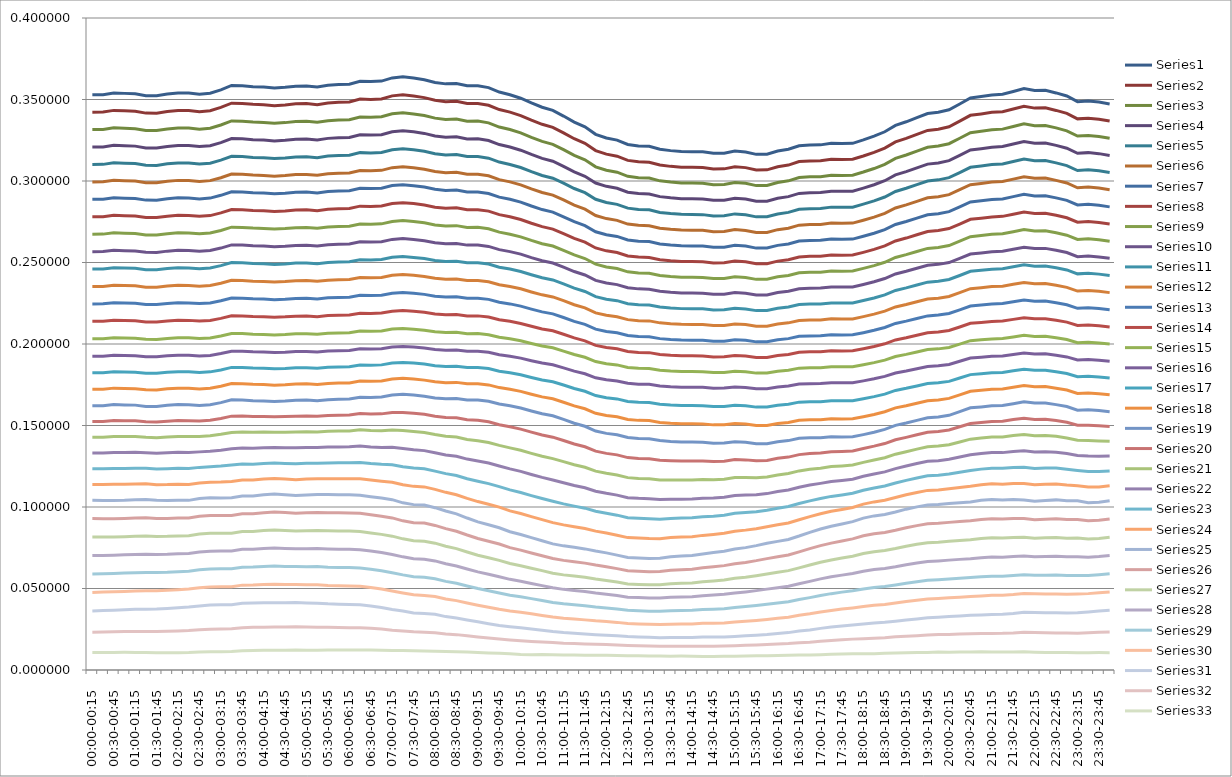
| Category | Series 0 | Series 1 | Series 2 | Series 3 | Series 4 | Series 5 | Series 6 | Series 7 | Series 8 | Series 9 | Series 10 | Series 11 | Series 12 | Series 13 | Series 14 | Series 15 | Series 16 | Series 17 | Series 18 | Series 19 | Series 20 | Series 21 | Series 22 | Series 23 | Series 24 | Series 25 | Series 26 | Series 27 | Series 28 | Series 29 | Series 30 | Series 31 | Series 32 |
|---|---|---|---|---|---|---|---|---|---|---|---|---|---|---|---|---|---|---|---|---|---|---|---|---|---|---|---|---|---|---|---|---|---|
| 00:00-00:15 | 0.353 | 0.342 | 0.332 | 0.321 | 0.31 | 0.299 | 0.289 | 0.278 | 0.267 | 0.257 | 0.246 | 0.235 | 0.225 | 0.214 | 0.203 | 0.193 | 0.182 | 0.172 | 0.162 | 0.152 | 0.143 | 0.133 | 0.124 | 0.114 | 0.104 | 0.093 | 0.082 | 0.07 | 0.059 | 0.048 | 0.036 | 0.023 | 0.011 |
| 00:15-00:30 | 0.353 | 0.342 | 0.332 | 0.321 | 0.31 | 0.3 | 0.289 | 0.278 | 0.267 | 0.257 | 0.246 | 0.235 | 0.225 | 0.214 | 0.203 | 0.193 | 0.182 | 0.172 | 0.162 | 0.152 | 0.143 | 0.133 | 0.123 | 0.114 | 0.104 | 0.093 | 0.082 | 0.07 | 0.059 | 0.048 | 0.036 | 0.023 | 0.011 |
| 00:30-00:45 | 0.354 | 0.343 | 0.333 | 0.322 | 0.311 | 0.3 | 0.29 | 0.279 | 0.268 | 0.257 | 0.247 | 0.236 | 0.225 | 0.215 | 0.204 | 0.193 | 0.183 | 0.173 | 0.163 | 0.153 | 0.143 | 0.133 | 0.124 | 0.114 | 0.104 | 0.093 | 0.082 | 0.07 | 0.059 | 0.048 | 0.037 | 0.023 | 0.011 |
| 00:45-01:00 | 0.354 | 0.343 | 0.332 | 0.322 | 0.311 | 0.3 | 0.289 | 0.279 | 0.268 | 0.257 | 0.247 | 0.236 | 0.225 | 0.214 | 0.204 | 0.193 | 0.183 | 0.173 | 0.163 | 0.153 | 0.143 | 0.133 | 0.124 | 0.114 | 0.104 | 0.093 | 0.082 | 0.071 | 0.059 | 0.048 | 0.037 | 0.024 | 0.011 |
| 01:00-01:15 | 0.354 | 0.343 | 0.332 | 0.321 | 0.311 | 0.3 | 0.289 | 0.279 | 0.268 | 0.257 | 0.246 | 0.236 | 0.225 | 0.214 | 0.204 | 0.193 | 0.183 | 0.173 | 0.163 | 0.153 | 0.143 | 0.134 | 0.124 | 0.114 | 0.104 | 0.093 | 0.082 | 0.071 | 0.06 | 0.048 | 0.037 | 0.024 | 0.011 |
| 01:15-01:30 | 0.352 | 0.342 | 0.331 | 0.32 | 0.31 | 0.299 | 0.288 | 0.278 | 0.267 | 0.256 | 0.246 | 0.235 | 0.224 | 0.214 | 0.203 | 0.192 | 0.182 | 0.172 | 0.162 | 0.152 | 0.143 | 0.133 | 0.124 | 0.114 | 0.105 | 0.093 | 0.082 | 0.071 | 0.06 | 0.049 | 0.037 | 0.024 | 0.011 |
| 01:30-01:45 | 0.352 | 0.342 | 0.331 | 0.32 | 0.31 | 0.299 | 0.288 | 0.278 | 0.267 | 0.256 | 0.246 | 0.235 | 0.224 | 0.213 | 0.203 | 0.192 | 0.182 | 0.172 | 0.162 | 0.152 | 0.143 | 0.133 | 0.123 | 0.114 | 0.104 | 0.093 | 0.082 | 0.071 | 0.06 | 0.049 | 0.037 | 0.024 | 0.011 |
| 01:45-02:00 | 0.353 | 0.343 | 0.332 | 0.321 | 0.311 | 0.3 | 0.289 | 0.278 | 0.268 | 0.257 | 0.246 | 0.236 | 0.225 | 0.214 | 0.203 | 0.193 | 0.183 | 0.172 | 0.162 | 0.153 | 0.143 | 0.133 | 0.123 | 0.114 | 0.104 | 0.093 | 0.082 | 0.071 | 0.06 | 0.049 | 0.038 | 0.024 | 0.011 |
| 02:00-02:15 | 0.354 | 0.343 | 0.333 | 0.322 | 0.311 | 0.3 | 0.29 | 0.279 | 0.268 | 0.257 | 0.247 | 0.236 | 0.225 | 0.215 | 0.204 | 0.193 | 0.183 | 0.173 | 0.163 | 0.153 | 0.143 | 0.134 | 0.124 | 0.114 | 0.104 | 0.093 | 0.082 | 0.071 | 0.06 | 0.049 | 0.038 | 0.024 | 0.011 |
| 02:15-02:30 | 0.354 | 0.343 | 0.332 | 0.322 | 0.311 | 0.3 | 0.29 | 0.279 | 0.268 | 0.257 | 0.247 | 0.236 | 0.225 | 0.214 | 0.204 | 0.193 | 0.183 | 0.173 | 0.163 | 0.153 | 0.143 | 0.133 | 0.124 | 0.114 | 0.104 | 0.093 | 0.082 | 0.071 | 0.061 | 0.05 | 0.039 | 0.024 | 0.011 |
| 02:30-02:45 | 0.353 | 0.343 | 0.332 | 0.321 | 0.31 | 0.3 | 0.289 | 0.278 | 0.268 | 0.257 | 0.246 | 0.235 | 0.225 | 0.214 | 0.203 | 0.193 | 0.183 | 0.172 | 0.162 | 0.153 | 0.143 | 0.134 | 0.124 | 0.115 | 0.105 | 0.094 | 0.083 | 0.072 | 0.061 | 0.05 | 0.039 | 0.025 | 0.011 |
| 02:45-03:00 | 0.354 | 0.343 | 0.332 | 0.322 | 0.311 | 0.3 | 0.29 | 0.279 | 0.268 | 0.257 | 0.247 | 0.236 | 0.225 | 0.214 | 0.204 | 0.193 | 0.183 | 0.173 | 0.163 | 0.153 | 0.144 | 0.134 | 0.125 | 0.115 | 0.106 | 0.095 | 0.084 | 0.073 | 0.062 | 0.051 | 0.04 | 0.025 | 0.011 |
| 03:00-03:15 | 0.356 | 0.345 | 0.334 | 0.324 | 0.313 | 0.302 | 0.291 | 0.28 | 0.27 | 0.259 | 0.248 | 0.237 | 0.226 | 0.216 | 0.205 | 0.194 | 0.184 | 0.174 | 0.164 | 0.154 | 0.145 | 0.135 | 0.125 | 0.115 | 0.106 | 0.095 | 0.084 | 0.073 | 0.062 | 0.051 | 0.04 | 0.025 | 0.011 |
| 03:15-03:30 | 0.359 | 0.348 | 0.337 | 0.326 | 0.315 | 0.304 | 0.293 | 0.283 | 0.272 | 0.261 | 0.25 | 0.239 | 0.228 | 0.217 | 0.206 | 0.196 | 0.186 | 0.176 | 0.166 | 0.156 | 0.146 | 0.136 | 0.126 | 0.116 | 0.106 | 0.095 | 0.084 | 0.073 | 0.062 | 0.051 | 0.04 | 0.025 | 0.011 |
| 03:30-03:45 | 0.358 | 0.348 | 0.337 | 0.326 | 0.315 | 0.304 | 0.293 | 0.282 | 0.272 | 0.261 | 0.25 | 0.239 | 0.228 | 0.217 | 0.206 | 0.196 | 0.186 | 0.176 | 0.166 | 0.156 | 0.146 | 0.136 | 0.126 | 0.117 | 0.107 | 0.096 | 0.085 | 0.074 | 0.063 | 0.052 | 0.041 | 0.026 | 0.012 |
| 03:45-04:00 | 0.358 | 0.347 | 0.336 | 0.325 | 0.314 | 0.304 | 0.293 | 0.282 | 0.271 | 0.26 | 0.249 | 0.239 | 0.228 | 0.217 | 0.206 | 0.195 | 0.185 | 0.175 | 0.165 | 0.156 | 0.146 | 0.136 | 0.126 | 0.117 | 0.107 | 0.096 | 0.085 | 0.074 | 0.063 | 0.052 | 0.041 | 0.026 | 0.012 |
| 04:00-04:15 | 0.358 | 0.347 | 0.336 | 0.325 | 0.314 | 0.303 | 0.293 | 0.282 | 0.271 | 0.26 | 0.249 | 0.238 | 0.228 | 0.217 | 0.206 | 0.195 | 0.185 | 0.175 | 0.165 | 0.156 | 0.146 | 0.136 | 0.127 | 0.117 | 0.108 | 0.097 | 0.086 | 0.075 | 0.064 | 0.052 | 0.041 | 0.026 | 0.012 |
| 04:15-04:30 | 0.357 | 0.346 | 0.335 | 0.325 | 0.314 | 0.303 | 0.292 | 0.281 | 0.27 | 0.26 | 0.249 | 0.238 | 0.227 | 0.216 | 0.206 | 0.195 | 0.185 | 0.175 | 0.165 | 0.155 | 0.146 | 0.136 | 0.127 | 0.118 | 0.108 | 0.097 | 0.086 | 0.075 | 0.064 | 0.053 | 0.041 | 0.026 | 0.012 |
| 04:30-04:45 | 0.357 | 0.347 | 0.336 | 0.325 | 0.314 | 0.303 | 0.292 | 0.282 | 0.271 | 0.26 | 0.249 | 0.238 | 0.227 | 0.217 | 0.206 | 0.195 | 0.185 | 0.175 | 0.165 | 0.155 | 0.146 | 0.136 | 0.127 | 0.117 | 0.108 | 0.097 | 0.086 | 0.075 | 0.064 | 0.052 | 0.041 | 0.026 | 0.012 |
| 04:45-05:00 | 0.358 | 0.347 | 0.336 | 0.326 | 0.315 | 0.304 | 0.293 | 0.282 | 0.271 | 0.261 | 0.25 | 0.239 | 0.228 | 0.217 | 0.206 | 0.195 | 0.185 | 0.175 | 0.165 | 0.156 | 0.146 | 0.136 | 0.127 | 0.117 | 0.107 | 0.096 | 0.085 | 0.074 | 0.063 | 0.052 | 0.041 | 0.026 | 0.012 |
| 05:00-05:15 | 0.358 | 0.347 | 0.337 | 0.326 | 0.315 | 0.304 | 0.293 | 0.282 | 0.271 | 0.261 | 0.25 | 0.239 | 0.228 | 0.217 | 0.206 | 0.195 | 0.185 | 0.176 | 0.166 | 0.156 | 0.146 | 0.137 | 0.127 | 0.117 | 0.107 | 0.096 | 0.085 | 0.074 | 0.063 | 0.052 | 0.041 | 0.026 | 0.012 |
| 05:15-05:30 | 0.358 | 0.347 | 0.336 | 0.325 | 0.314 | 0.303 | 0.293 | 0.282 | 0.271 | 0.26 | 0.249 | 0.238 | 0.228 | 0.217 | 0.206 | 0.195 | 0.185 | 0.175 | 0.165 | 0.156 | 0.146 | 0.136 | 0.127 | 0.117 | 0.108 | 0.097 | 0.086 | 0.075 | 0.063 | 0.052 | 0.041 | 0.026 | 0.012 |
| 05:30-05:45 | 0.359 | 0.348 | 0.337 | 0.326 | 0.315 | 0.304 | 0.294 | 0.283 | 0.272 | 0.261 | 0.25 | 0.239 | 0.228 | 0.217 | 0.207 | 0.196 | 0.186 | 0.176 | 0.166 | 0.156 | 0.146 | 0.137 | 0.127 | 0.117 | 0.108 | 0.097 | 0.085 | 0.074 | 0.063 | 0.052 | 0.041 | 0.026 | 0.012 |
| 05:45-06:00 | 0.359 | 0.348 | 0.337 | 0.326 | 0.316 | 0.305 | 0.294 | 0.283 | 0.272 | 0.261 | 0.25 | 0.239 | 0.229 | 0.218 | 0.207 | 0.196 | 0.186 | 0.176 | 0.166 | 0.156 | 0.147 | 0.137 | 0.127 | 0.117 | 0.108 | 0.096 | 0.085 | 0.074 | 0.063 | 0.052 | 0.04 | 0.026 | 0.012 |
| 06:00-06:15 | 0.359 | 0.348 | 0.338 | 0.327 | 0.316 | 0.305 | 0.294 | 0.283 | 0.272 | 0.261 | 0.25 | 0.24 | 0.229 | 0.218 | 0.207 | 0.196 | 0.186 | 0.176 | 0.166 | 0.156 | 0.147 | 0.137 | 0.127 | 0.117 | 0.108 | 0.096 | 0.085 | 0.074 | 0.063 | 0.052 | 0.04 | 0.026 | 0.012 |
| 06:15-06:30 | 0.361 | 0.35 | 0.339 | 0.328 | 0.317 | 0.306 | 0.296 | 0.285 | 0.274 | 0.263 | 0.252 | 0.241 | 0.23 | 0.219 | 0.208 | 0.197 | 0.187 | 0.177 | 0.167 | 0.157 | 0.147 | 0.137 | 0.127 | 0.117 | 0.107 | 0.096 | 0.085 | 0.074 | 0.063 | 0.051 | 0.04 | 0.026 | 0.012 |
| 06:30-06:45 | 0.361 | 0.35 | 0.339 | 0.328 | 0.317 | 0.306 | 0.295 | 0.284 | 0.273 | 0.263 | 0.252 | 0.241 | 0.23 | 0.219 | 0.208 | 0.197 | 0.187 | 0.177 | 0.167 | 0.157 | 0.147 | 0.137 | 0.127 | 0.117 | 0.106 | 0.095 | 0.084 | 0.073 | 0.062 | 0.051 | 0.039 | 0.026 | 0.012 |
| 06:45-07:00 | 0.361 | 0.35 | 0.339 | 0.328 | 0.317 | 0.307 | 0.296 | 0.285 | 0.274 | 0.263 | 0.252 | 0.241 | 0.23 | 0.219 | 0.208 | 0.197 | 0.187 | 0.177 | 0.167 | 0.157 | 0.147 | 0.136 | 0.126 | 0.116 | 0.105 | 0.094 | 0.083 | 0.072 | 0.061 | 0.05 | 0.038 | 0.025 | 0.012 |
| 07:00-07:15 | 0.363 | 0.352 | 0.341 | 0.33 | 0.319 | 0.308 | 0.297 | 0.286 | 0.275 | 0.264 | 0.253 | 0.242 | 0.231 | 0.22 | 0.209 | 0.198 | 0.188 | 0.179 | 0.169 | 0.158 | 0.147 | 0.137 | 0.126 | 0.115 | 0.105 | 0.093 | 0.082 | 0.071 | 0.06 | 0.048 | 0.037 | 0.024 | 0.012 |
| 07:15-07:30 | 0.364 | 0.353 | 0.342 | 0.331 | 0.32 | 0.309 | 0.298 | 0.287 | 0.276 | 0.265 | 0.254 | 0.243 | 0.232 | 0.221 | 0.21 | 0.198 | 0.189 | 0.179 | 0.169 | 0.158 | 0.147 | 0.136 | 0.125 | 0.114 | 0.103 | 0.092 | 0.08 | 0.069 | 0.058 | 0.047 | 0.036 | 0.024 | 0.012 |
| 07:30-07:45 | 0.363 | 0.352 | 0.341 | 0.33 | 0.319 | 0.308 | 0.297 | 0.286 | 0.275 | 0.264 | 0.253 | 0.242 | 0.231 | 0.22 | 0.209 | 0.198 | 0.188 | 0.178 | 0.169 | 0.157 | 0.146 | 0.135 | 0.124 | 0.113 | 0.101 | 0.09 | 0.079 | 0.068 | 0.057 | 0.046 | 0.035 | 0.023 | 0.012 |
| 07:45-08:00 | 0.362 | 0.351 | 0.34 | 0.329 | 0.318 | 0.307 | 0.296 | 0.285 | 0.274 | 0.263 | 0.252 | 0.241 | 0.23 | 0.219 | 0.208 | 0.198 | 0.188 | 0.178 | 0.168 | 0.157 | 0.146 | 0.135 | 0.123 | 0.112 | 0.101 | 0.09 | 0.079 | 0.068 | 0.057 | 0.046 | 0.035 | 0.023 | 0.012 |
| 08:00-08:15 | 0.36 | 0.349 | 0.339 | 0.328 | 0.317 | 0.306 | 0.295 | 0.284 | 0.273 | 0.262 | 0.251 | 0.24 | 0.229 | 0.218 | 0.208 | 0.197 | 0.187 | 0.177 | 0.167 | 0.156 | 0.144 | 0.133 | 0.122 | 0.111 | 0.1 | 0.089 | 0.078 | 0.067 | 0.056 | 0.045 | 0.034 | 0.023 | 0.012 |
| 08:15-08:30 | 0.36 | 0.349 | 0.338 | 0.327 | 0.316 | 0.305 | 0.294 | 0.283 | 0.272 | 0.262 | 0.251 | 0.24 | 0.229 | 0.218 | 0.207 | 0.196 | 0.186 | 0.176 | 0.166 | 0.155 | 0.143 | 0.132 | 0.12 | 0.109 | 0.098 | 0.087 | 0.076 | 0.065 | 0.054 | 0.044 | 0.033 | 0.022 | 0.011 |
| 08:30-08:45 | 0.36 | 0.349 | 0.338 | 0.327 | 0.316 | 0.305 | 0.294 | 0.284 | 0.273 | 0.262 | 0.251 | 0.24 | 0.229 | 0.218 | 0.207 | 0.196 | 0.186 | 0.176 | 0.167 | 0.155 | 0.143 | 0.131 | 0.119 | 0.108 | 0.096 | 0.085 | 0.074 | 0.064 | 0.053 | 0.043 | 0.032 | 0.022 | 0.011 |
| 08:45-09:00 | 0.358 | 0.348 | 0.337 | 0.326 | 0.315 | 0.304 | 0.293 | 0.282 | 0.272 | 0.261 | 0.25 | 0.239 | 0.228 | 0.217 | 0.206 | 0.196 | 0.186 | 0.176 | 0.166 | 0.154 | 0.141 | 0.129 | 0.117 | 0.105 | 0.093 | 0.083 | 0.072 | 0.062 | 0.052 | 0.041 | 0.031 | 0.021 | 0.011 |
| 09:00-09:15 | 0.358 | 0.348 | 0.337 | 0.326 | 0.315 | 0.304 | 0.293 | 0.282 | 0.272 | 0.261 | 0.25 | 0.239 | 0.228 | 0.217 | 0.206 | 0.196 | 0.186 | 0.176 | 0.166 | 0.153 | 0.141 | 0.128 | 0.116 | 0.103 | 0.091 | 0.081 | 0.07 | 0.06 | 0.05 | 0.04 | 0.03 | 0.02 | 0.011 |
| 09:15-09:30 | 0.357 | 0.346 | 0.336 | 0.325 | 0.314 | 0.303 | 0.292 | 0.282 | 0.271 | 0.26 | 0.249 | 0.238 | 0.227 | 0.217 | 0.206 | 0.195 | 0.185 | 0.175 | 0.165 | 0.152 | 0.14 | 0.127 | 0.114 | 0.102 | 0.089 | 0.079 | 0.069 | 0.059 | 0.049 | 0.039 | 0.028 | 0.02 | 0.01 |
| 09:30-09:45 | 0.355 | 0.344 | 0.333 | 0.322 | 0.312 | 0.301 | 0.29 | 0.279 | 0.269 | 0.258 | 0.247 | 0.236 | 0.226 | 0.215 | 0.204 | 0.193 | 0.183 | 0.173 | 0.163 | 0.15 | 0.138 | 0.125 | 0.113 | 0.1 | 0.087 | 0.077 | 0.067 | 0.057 | 0.047 | 0.037 | 0.027 | 0.019 | 0.01 |
| 09:45-10:00 | 0.353 | 0.342 | 0.332 | 0.321 | 0.31 | 0.299 | 0.289 | 0.278 | 0.267 | 0.257 | 0.246 | 0.235 | 0.225 | 0.214 | 0.203 | 0.193 | 0.182 | 0.172 | 0.162 | 0.149 | 0.136 | 0.123 | 0.111 | 0.098 | 0.085 | 0.075 | 0.065 | 0.056 | 0.046 | 0.036 | 0.027 | 0.018 | 0.01 |
| 10:00-10:15 | 0.351 | 0.34 | 0.33 | 0.319 | 0.308 | 0.298 | 0.287 | 0.276 | 0.266 | 0.255 | 0.244 | 0.234 | 0.223 | 0.213 | 0.202 | 0.191 | 0.181 | 0.171 | 0.161 | 0.148 | 0.135 | 0.122 | 0.109 | 0.096 | 0.083 | 0.074 | 0.064 | 0.054 | 0.045 | 0.035 | 0.026 | 0.018 | 0.01 |
| 10:15-10:30 | 0.348 | 0.337 | 0.327 | 0.316 | 0.306 | 0.295 | 0.285 | 0.274 | 0.264 | 0.253 | 0.242 | 0.232 | 0.221 | 0.211 | 0.2 | 0.19 | 0.179 | 0.169 | 0.159 | 0.146 | 0.133 | 0.12 | 0.107 | 0.094 | 0.081 | 0.072 | 0.062 | 0.053 | 0.044 | 0.034 | 0.025 | 0.018 | 0.009 |
| 10:30-10:45 | 0.345 | 0.335 | 0.324 | 0.314 | 0.303 | 0.293 | 0.282 | 0.272 | 0.262 | 0.251 | 0.241 | 0.23 | 0.22 | 0.209 | 0.199 | 0.188 | 0.178 | 0.168 | 0.157 | 0.144 | 0.131 | 0.118 | 0.105 | 0.092 | 0.079 | 0.07 | 0.061 | 0.052 | 0.043 | 0.033 | 0.024 | 0.017 | 0.009 |
| 10:45-11:00 | 0.343 | 0.333 | 0.323 | 0.312 | 0.302 | 0.291 | 0.281 | 0.271 | 0.26 | 0.25 | 0.239 | 0.229 | 0.218 | 0.208 | 0.198 | 0.187 | 0.177 | 0.166 | 0.156 | 0.143 | 0.13 | 0.117 | 0.103 | 0.09 | 0.077 | 0.068 | 0.059 | 0.05 | 0.041 | 0.032 | 0.024 | 0.017 | 0.009 |
| 11:00-11:15 | 0.34 | 0.33 | 0.319 | 0.309 | 0.299 | 0.288 | 0.278 | 0.268 | 0.257 | 0.247 | 0.237 | 0.227 | 0.216 | 0.206 | 0.196 | 0.185 | 0.175 | 0.164 | 0.154 | 0.141 | 0.128 | 0.115 | 0.102 | 0.089 | 0.076 | 0.067 | 0.058 | 0.049 | 0.041 | 0.032 | 0.023 | 0.016 | 0.009 |
| 11:15-11:30 | 0.336 | 0.326 | 0.316 | 0.306 | 0.295 | 0.285 | 0.275 | 0.265 | 0.255 | 0.244 | 0.234 | 0.224 | 0.214 | 0.204 | 0.194 | 0.183 | 0.173 | 0.162 | 0.151 | 0.139 | 0.126 | 0.113 | 0.101 | 0.088 | 0.075 | 0.066 | 0.058 | 0.049 | 0.04 | 0.031 | 0.023 | 0.016 | 0.009 |
| 11:30-11:45 | 0.333 | 0.323 | 0.313 | 0.303 | 0.293 | 0.283 | 0.273 | 0.263 | 0.252 | 0.242 | 0.232 | 0.222 | 0.212 | 0.202 | 0.192 | 0.182 | 0.171 | 0.16 | 0.15 | 0.137 | 0.124 | 0.112 | 0.099 | 0.087 | 0.074 | 0.066 | 0.057 | 0.048 | 0.039 | 0.031 | 0.022 | 0.016 | 0.009 |
| 11:45-12:00 | 0.329 | 0.319 | 0.309 | 0.299 | 0.289 | 0.279 | 0.269 | 0.259 | 0.249 | 0.239 | 0.229 | 0.219 | 0.209 | 0.199 | 0.189 | 0.179 | 0.168 | 0.157 | 0.147 | 0.134 | 0.122 | 0.11 | 0.097 | 0.085 | 0.073 | 0.064 | 0.056 | 0.047 | 0.039 | 0.03 | 0.022 | 0.016 | 0.009 |
| 12:00-12:15 | 0.326 | 0.316 | 0.307 | 0.297 | 0.287 | 0.277 | 0.267 | 0.257 | 0.247 | 0.237 | 0.227 | 0.218 | 0.208 | 0.198 | 0.188 | 0.178 | 0.167 | 0.156 | 0.145 | 0.133 | 0.121 | 0.108 | 0.096 | 0.084 | 0.072 | 0.063 | 0.055 | 0.047 | 0.038 | 0.03 | 0.021 | 0.016 | 0.009 |
| 12:15-12:30 | 0.325 | 0.315 | 0.305 | 0.296 | 0.286 | 0.276 | 0.266 | 0.256 | 0.246 | 0.236 | 0.227 | 0.217 | 0.207 | 0.197 | 0.187 | 0.177 | 0.166 | 0.155 | 0.144 | 0.132 | 0.12 | 0.107 | 0.095 | 0.083 | 0.07 | 0.062 | 0.054 | 0.046 | 0.037 | 0.029 | 0.021 | 0.015 | 0.009 |
| 12:30-12:45 | 0.322 | 0.313 | 0.303 | 0.293 | 0.283 | 0.274 | 0.264 | 0.254 | 0.244 | 0.234 | 0.225 | 0.215 | 0.205 | 0.195 | 0.186 | 0.176 | 0.165 | 0.154 | 0.143 | 0.13 | 0.118 | 0.106 | 0.093 | 0.081 | 0.069 | 0.061 | 0.053 | 0.045 | 0.037 | 0.029 | 0.021 | 0.015 | 0.009 |
| 12:45-13:00 | 0.322 | 0.312 | 0.302 | 0.292 | 0.283 | 0.273 | 0.263 | 0.253 | 0.244 | 0.234 | 0.224 | 0.214 | 0.205 | 0.195 | 0.185 | 0.175 | 0.164 | 0.153 | 0.142 | 0.13 | 0.118 | 0.105 | 0.093 | 0.081 | 0.069 | 0.061 | 0.053 | 0.044 | 0.036 | 0.028 | 0.02 | 0.015 | 0.009 |
| 13:00-13:15 | 0.321 | 0.312 | 0.302 | 0.292 | 0.282 | 0.273 | 0.263 | 0.253 | 0.243 | 0.234 | 0.224 | 0.214 | 0.204 | 0.195 | 0.185 | 0.175 | 0.164 | 0.153 | 0.142 | 0.13 | 0.117 | 0.105 | 0.093 | 0.081 | 0.068 | 0.06 | 0.052 | 0.044 | 0.036 | 0.028 | 0.02 | 0.015 | 0.009 |
| 13:15-13:30 | 0.319 | 0.31 | 0.3 | 0.29 | 0.281 | 0.271 | 0.261 | 0.252 | 0.242 | 0.232 | 0.223 | 0.213 | 0.203 | 0.194 | 0.184 | 0.174 | 0.163 | 0.152 | 0.141 | 0.129 | 0.117 | 0.105 | 0.093 | 0.081 | 0.069 | 0.06 | 0.052 | 0.044 | 0.036 | 0.028 | 0.02 | 0.015 | 0.009 |
| 13:30-13:45 | 0.319 | 0.309 | 0.299 | 0.29 | 0.28 | 0.27 | 0.261 | 0.251 | 0.241 | 0.232 | 0.222 | 0.212 | 0.203 | 0.193 | 0.183 | 0.174 | 0.163 | 0.151 | 0.14 | 0.128 | 0.117 | 0.105 | 0.093 | 0.081 | 0.07 | 0.061 | 0.053 | 0.045 | 0.036 | 0.028 | 0.02 | 0.015 | 0.008 |
| 13:45-14:00 | 0.318 | 0.308 | 0.299 | 0.289 | 0.28 | 0.27 | 0.26 | 0.251 | 0.241 | 0.231 | 0.222 | 0.212 | 0.202 | 0.193 | 0.183 | 0.174 | 0.162 | 0.151 | 0.14 | 0.128 | 0.116 | 0.105 | 0.093 | 0.082 | 0.07 | 0.062 | 0.053 | 0.045 | 0.036 | 0.028 | 0.02 | 0.015 | 0.009 |
| 14:00-14:15 | 0.318 | 0.308 | 0.299 | 0.289 | 0.279 | 0.27 | 0.26 | 0.251 | 0.241 | 0.231 | 0.222 | 0.212 | 0.202 | 0.193 | 0.183 | 0.173 | 0.162 | 0.151 | 0.14 | 0.128 | 0.117 | 0.105 | 0.093 | 0.082 | 0.07 | 0.062 | 0.053 | 0.045 | 0.037 | 0.028 | 0.02 | 0.015 | 0.008 |
| 14:15-14:30 | 0.318 | 0.308 | 0.299 | 0.289 | 0.279 | 0.27 | 0.26 | 0.25 | 0.241 | 0.231 | 0.222 | 0.212 | 0.202 | 0.193 | 0.183 | 0.173 | 0.162 | 0.151 | 0.14 | 0.128 | 0.117 | 0.105 | 0.094 | 0.083 | 0.071 | 0.063 | 0.054 | 0.046 | 0.037 | 0.029 | 0.02 | 0.015 | 0.008 |
| 14:30-14:45 | 0.317 | 0.307 | 0.298 | 0.288 | 0.279 | 0.269 | 0.259 | 0.25 | 0.24 | 0.231 | 0.221 | 0.211 | 0.202 | 0.192 | 0.182 | 0.173 | 0.162 | 0.15 | 0.139 | 0.128 | 0.117 | 0.106 | 0.094 | 0.083 | 0.072 | 0.063 | 0.055 | 0.046 | 0.037 | 0.029 | 0.02 | 0.015 | 0.008 |
| 14:45-15:00 | 0.317 | 0.307 | 0.298 | 0.288 | 0.279 | 0.269 | 0.259 | 0.25 | 0.24 | 0.231 | 0.221 | 0.211 | 0.202 | 0.192 | 0.183 | 0.173 | 0.162 | 0.15 | 0.139 | 0.128 | 0.117 | 0.106 | 0.095 | 0.084 | 0.073 | 0.064 | 0.055 | 0.046 | 0.038 | 0.029 | 0.02 | 0.015 | 0.008 |
| 15:00-15:15 | 0.318 | 0.309 | 0.299 | 0.289 | 0.28 | 0.27 | 0.261 | 0.251 | 0.241 | 0.232 | 0.222 | 0.212 | 0.203 | 0.193 | 0.183 | 0.174 | 0.162 | 0.151 | 0.14 | 0.129 | 0.118 | 0.107 | 0.096 | 0.085 | 0.074 | 0.065 | 0.056 | 0.047 | 0.038 | 0.029 | 0.021 | 0.015 | 0.008 |
| 15:15-15:30 | 0.318 | 0.308 | 0.299 | 0.289 | 0.279 | 0.27 | 0.26 | 0.25 | 0.241 | 0.231 | 0.222 | 0.212 | 0.202 | 0.193 | 0.183 | 0.173 | 0.162 | 0.151 | 0.14 | 0.129 | 0.118 | 0.107 | 0.097 | 0.086 | 0.075 | 0.066 | 0.057 | 0.048 | 0.039 | 0.03 | 0.021 | 0.015 | 0.009 |
| 15:30-15:45 | 0.316 | 0.307 | 0.297 | 0.288 | 0.278 | 0.268 | 0.259 | 0.249 | 0.24 | 0.23 | 0.22 | 0.211 | 0.201 | 0.192 | 0.182 | 0.173 | 0.161 | 0.15 | 0.139 | 0.128 | 0.118 | 0.107 | 0.097 | 0.087 | 0.076 | 0.067 | 0.058 | 0.049 | 0.04 | 0.03 | 0.021 | 0.015 | 0.009 |
| 15:45-16:00 | 0.316 | 0.307 | 0.297 | 0.288 | 0.278 | 0.268 | 0.259 | 0.249 | 0.24 | 0.23 | 0.221 | 0.211 | 0.201 | 0.192 | 0.182 | 0.173 | 0.161 | 0.15 | 0.139 | 0.129 | 0.118 | 0.108 | 0.098 | 0.088 | 0.078 | 0.068 | 0.059 | 0.05 | 0.04 | 0.031 | 0.022 | 0.016 | 0.009 |
| 16:00-16:15 | 0.318 | 0.309 | 0.299 | 0.289 | 0.28 | 0.27 | 0.261 | 0.251 | 0.241 | 0.232 | 0.222 | 0.212 | 0.203 | 0.193 | 0.183 | 0.174 | 0.162 | 0.151 | 0.14 | 0.13 | 0.12 | 0.109 | 0.099 | 0.089 | 0.079 | 0.069 | 0.06 | 0.051 | 0.041 | 0.032 | 0.022 | 0.016 | 0.009 |
| 16:15-16:30 | 0.319 | 0.31 | 0.3 | 0.29 | 0.281 | 0.271 | 0.261 | 0.252 | 0.242 | 0.232 | 0.223 | 0.213 | 0.203 | 0.194 | 0.184 | 0.174 | 0.163 | 0.152 | 0.141 | 0.131 | 0.121 | 0.11 | 0.1 | 0.09 | 0.08 | 0.071 | 0.061 | 0.051 | 0.042 | 0.032 | 0.023 | 0.016 | 0.009 |
| 16:30-16:45 | 0.322 | 0.312 | 0.302 | 0.292 | 0.283 | 0.273 | 0.263 | 0.253 | 0.244 | 0.234 | 0.224 | 0.214 | 0.205 | 0.195 | 0.185 | 0.175 | 0.164 | 0.153 | 0.142 | 0.132 | 0.122 | 0.112 | 0.102 | 0.092 | 0.082 | 0.072 | 0.063 | 0.053 | 0.043 | 0.034 | 0.024 | 0.017 | 0.009 |
| 16:45-17:00 | 0.322 | 0.312 | 0.303 | 0.293 | 0.283 | 0.273 | 0.264 | 0.254 | 0.244 | 0.234 | 0.224 | 0.215 | 0.205 | 0.195 | 0.185 | 0.176 | 0.165 | 0.153 | 0.142 | 0.133 | 0.123 | 0.113 | 0.104 | 0.094 | 0.084 | 0.074 | 0.064 | 0.054 | 0.044 | 0.034 | 0.025 | 0.017 | 0.009 |
| 17:00-17:15 | 0.322 | 0.312 | 0.303 | 0.293 | 0.283 | 0.273 | 0.264 | 0.254 | 0.244 | 0.234 | 0.225 | 0.215 | 0.205 | 0.195 | 0.185 | 0.176 | 0.165 | 0.154 | 0.142 | 0.133 | 0.124 | 0.114 | 0.105 | 0.096 | 0.087 | 0.076 | 0.066 | 0.056 | 0.046 | 0.036 | 0.026 | 0.018 | 0.009 |
| 17:15-17:30 | 0.323 | 0.313 | 0.304 | 0.294 | 0.284 | 0.274 | 0.264 | 0.255 | 0.245 | 0.235 | 0.225 | 0.215 | 0.206 | 0.196 | 0.186 | 0.176 | 0.165 | 0.154 | 0.143 | 0.134 | 0.125 | 0.116 | 0.107 | 0.097 | 0.088 | 0.078 | 0.067 | 0.057 | 0.047 | 0.037 | 0.026 | 0.018 | 0.01 |
| 17:30-17:45 | 0.323 | 0.313 | 0.303 | 0.294 | 0.284 | 0.274 | 0.264 | 0.254 | 0.245 | 0.235 | 0.225 | 0.215 | 0.206 | 0.196 | 0.186 | 0.176 | 0.165 | 0.154 | 0.143 | 0.134 | 0.125 | 0.116 | 0.107 | 0.099 | 0.09 | 0.079 | 0.069 | 0.058 | 0.048 | 0.037 | 0.027 | 0.019 | 0.01 |
| 17:45-18:00 | 0.323 | 0.313 | 0.304 | 0.294 | 0.284 | 0.274 | 0.264 | 0.255 | 0.245 | 0.235 | 0.225 | 0.215 | 0.206 | 0.196 | 0.186 | 0.176 | 0.165 | 0.154 | 0.143 | 0.134 | 0.126 | 0.117 | 0.108 | 0.1 | 0.091 | 0.08 | 0.07 | 0.059 | 0.049 | 0.038 | 0.028 | 0.019 | 0.01 |
| 18:00-18:15 | 0.325 | 0.315 | 0.306 | 0.296 | 0.286 | 0.276 | 0.266 | 0.256 | 0.246 | 0.237 | 0.227 | 0.217 | 0.207 | 0.197 | 0.187 | 0.177 | 0.166 | 0.155 | 0.144 | 0.136 | 0.127 | 0.119 | 0.11 | 0.102 | 0.093 | 0.082 | 0.071 | 0.061 | 0.05 | 0.039 | 0.028 | 0.019 | 0.01 |
| 18:15-18:30 | 0.327 | 0.318 | 0.308 | 0.298 | 0.288 | 0.278 | 0.268 | 0.258 | 0.248 | 0.238 | 0.228 | 0.218 | 0.208 | 0.198 | 0.189 | 0.179 | 0.168 | 0.157 | 0.146 | 0.137 | 0.129 | 0.12 | 0.112 | 0.103 | 0.095 | 0.084 | 0.073 | 0.062 | 0.051 | 0.04 | 0.029 | 0.02 | 0.01 |
| 18:30-18:45 | 0.33 | 0.32 | 0.31 | 0.3 | 0.29 | 0.28 | 0.27 | 0.26 | 0.25 | 0.24 | 0.23 | 0.22 | 0.21 | 0.2 | 0.19 | 0.18 | 0.169 | 0.158 | 0.148 | 0.139 | 0.13 | 0.122 | 0.113 | 0.104 | 0.095 | 0.084 | 0.073 | 0.062 | 0.051 | 0.04 | 0.029 | 0.02 | 0.01 |
| 18:45-19:00 | 0.334 | 0.324 | 0.314 | 0.304 | 0.294 | 0.283 | 0.273 | 0.263 | 0.253 | 0.243 | 0.233 | 0.223 | 0.213 | 0.202 | 0.192 | 0.182 | 0.172 | 0.161 | 0.15 | 0.141 | 0.132 | 0.124 | 0.115 | 0.106 | 0.097 | 0.086 | 0.075 | 0.063 | 0.052 | 0.041 | 0.03 | 0.02 | 0.01 |
| 19:00-19:15 | 0.336 | 0.326 | 0.316 | 0.306 | 0.296 | 0.285 | 0.275 | 0.265 | 0.255 | 0.245 | 0.234 | 0.224 | 0.214 | 0.204 | 0.194 | 0.183 | 0.173 | 0.162 | 0.152 | 0.143 | 0.134 | 0.125 | 0.116 | 0.108 | 0.099 | 0.087 | 0.076 | 0.065 | 0.053 | 0.042 | 0.031 | 0.021 | 0.011 |
| 19:15-19:30 | 0.339 | 0.329 | 0.318 | 0.308 | 0.298 | 0.288 | 0.277 | 0.267 | 0.257 | 0.246 | 0.236 | 0.226 | 0.216 | 0.205 | 0.195 | 0.185 | 0.174 | 0.164 | 0.153 | 0.144 | 0.135 | 0.127 | 0.118 | 0.109 | 0.1 | 0.089 | 0.077 | 0.066 | 0.054 | 0.043 | 0.031 | 0.021 | 0.011 |
| 19:30-19:45 | 0.341 | 0.331 | 0.321 | 0.31 | 0.3 | 0.29 | 0.279 | 0.269 | 0.259 | 0.248 | 0.238 | 0.228 | 0.217 | 0.207 | 0.197 | 0.186 | 0.176 | 0.165 | 0.155 | 0.146 | 0.137 | 0.128 | 0.119 | 0.11 | 0.101 | 0.09 | 0.078 | 0.067 | 0.055 | 0.044 | 0.032 | 0.021 | 0.011 |
| 19:45-20:00 | 0.342 | 0.332 | 0.321 | 0.311 | 0.301 | 0.29 | 0.28 | 0.27 | 0.259 | 0.249 | 0.238 | 0.228 | 0.218 | 0.207 | 0.197 | 0.187 | 0.176 | 0.166 | 0.155 | 0.146 | 0.137 | 0.128 | 0.119 | 0.11 | 0.102 | 0.09 | 0.078 | 0.067 | 0.055 | 0.044 | 0.032 | 0.022 | 0.011 |
| 20:00-20:15 | 0.344 | 0.333 | 0.323 | 0.312 | 0.302 | 0.292 | 0.281 | 0.271 | 0.26 | 0.25 | 0.24 | 0.229 | 0.219 | 0.208 | 0.198 | 0.187 | 0.177 | 0.167 | 0.156 | 0.147 | 0.138 | 0.129 | 0.12 | 0.111 | 0.102 | 0.091 | 0.079 | 0.067 | 0.056 | 0.044 | 0.033 | 0.022 | 0.011 |
| 20:15-20:30 | 0.347 | 0.337 | 0.326 | 0.316 | 0.305 | 0.295 | 0.284 | 0.274 | 0.263 | 0.253 | 0.242 | 0.232 | 0.221 | 0.21 | 0.2 | 0.189 | 0.179 | 0.169 | 0.158 | 0.149 | 0.14 | 0.131 | 0.121 | 0.112 | 0.103 | 0.091 | 0.079 | 0.068 | 0.056 | 0.045 | 0.033 | 0.022 | 0.011 |
| 20:30-20:45 | 0.351 | 0.34 | 0.33 | 0.319 | 0.308 | 0.298 | 0.287 | 0.276 | 0.266 | 0.255 | 0.245 | 0.234 | 0.223 | 0.213 | 0.202 | 0.191 | 0.181 | 0.171 | 0.161 | 0.151 | 0.142 | 0.132 | 0.122 | 0.113 | 0.103 | 0.091 | 0.08 | 0.068 | 0.057 | 0.045 | 0.034 | 0.022 | 0.011 |
| 20:45-21:00 | 0.352 | 0.341 | 0.331 | 0.32 | 0.309 | 0.299 | 0.288 | 0.277 | 0.267 | 0.256 | 0.245 | 0.235 | 0.224 | 0.213 | 0.203 | 0.192 | 0.182 | 0.172 | 0.161 | 0.152 | 0.142 | 0.133 | 0.123 | 0.114 | 0.104 | 0.092 | 0.081 | 0.069 | 0.057 | 0.045 | 0.034 | 0.022 | 0.011 |
| 21:00-21:15 | 0.353 | 0.342 | 0.331 | 0.321 | 0.31 | 0.299 | 0.289 | 0.278 | 0.267 | 0.257 | 0.246 | 0.235 | 0.225 | 0.214 | 0.203 | 0.192 | 0.182 | 0.172 | 0.162 | 0.152 | 0.143 | 0.133 | 0.124 | 0.114 | 0.105 | 0.093 | 0.081 | 0.069 | 0.058 | 0.046 | 0.034 | 0.022 | 0.011 |
| 21:15-21:30 | 0.353 | 0.343 | 0.332 | 0.321 | 0.31 | 0.3 | 0.289 | 0.278 | 0.268 | 0.257 | 0.246 | 0.235 | 0.225 | 0.214 | 0.203 | 0.193 | 0.183 | 0.172 | 0.162 | 0.153 | 0.143 | 0.133 | 0.124 | 0.114 | 0.104 | 0.093 | 0.081 | 0.069 | 0.058 | 0.046 | 0.034 | 0.022 | 0.011 |
| 21:30-21:45 | 0.355 | 0.344 | 0.333 | 0.323 | 0.312 | 0.301 | 0.29 | 0.28 | 0.269 | 0.258 | 0.247 | 0.237 | 0.226 | 0.215 | 0.204 | 0.194 | 0.184 | 0.173 | 0.163 | 0.154 | 0.144 | 0.134 | 0.124 | 0.114 | 0.105 | 0.093 | 0.081 | 0.07 | 0.058 | 0.046 | 0.035 | 0.023 | 0.011 |
| 21:45-22:00 | 0.357 | 0.346 | 0.335 | 0.324 | 0.313 | 0.303 | 0.292 | 0.281 | 0.27 | 0.259 | 0.249 | 0.238 | 0.227 | 0.216 | 0.205 | 0.195 | 0.185 | 0.175 | 0.164 | 0.154 | 0.144 | 0.134 | 0.124 | 0.114 | 0.104 | 0.093 | 0.081 | 0.07 | 0.058 | 0.047 | 0.035 | 0.023 | 0.011 |
| 22:00-22:15 | 0.355 | 0.345 | 0.334 | 0.323 | 0.312 | 0.302 | 0.291 | 0.28 | 0.269 | 0.259 | 0.248 | 0.237 | 0.226 | 0.215 | 0.205 | 0.194 | 0.184 | 0.174 | 0.164 | 0.154 | 0.144 | 0.134 | 0.124 | 0.114 | 0.104 | 0.092 | 0.081 | 0.069 | 0.058 | 0.047 | 0.035 | 0.023 | 0.011 |
| 22:15-22:30 | 0.356 | 0.345 | 0.334 | 0.323 | 0.313 | 0.302 | 0.291 | 0.28 | 0.269 | 0.259 | 0.248 | 0.237 | 0.226 | 0.216 | 0.205 | 0.194 | 0.184 | 0.174 | 0.164 | 0.154 | 0.144 | 0.134 | 0.124 | 0.114 | 0.104 | 0.093 | 0.081 | 0.07 | 0.058 | 0.047 | 0.035 | 0.023 | 0.011 |
| 22:30-22:45 | 0.354 | 0.343 | 0.333 | 0.322 | 0.311 | 0.3 | 0.29 | 0.279 | 0.268 | 0.257 | 0.247 | 0.236 | 0.225 | 0.215 | 0.204 | 0.193 | 0.183 | 0.173 | 0.163 | 0.153 | 0.143 | 0.134 | 0.124 | 0.114 | 0.104 | 0.093 | 0.081 | 0.07 | 0.058 | 0.047 | 0.035 | 0.023 | 0.011 |
| 22:45-23:00 | 0.352 | 0.341 | 0.331 | 0.32 | 0.309 | 0.299 | 0.288 | 0.277 | 0.267 | 0.256 | 0.245 | 0.235 | 0.224 | 0.213 | 0.203 | 0.192 | 0.182 | 0.172 | 0.162 | 0.152 | 0.142 | 0.133 | 0.123 | 0.113 | 0.104 | 0.092 | 0.081 | 0.069 | 0.058 | 0.046 | 0.035 | 0.023 | 0.011 |
| 23:00-23:15 | 0.349 | 0.338 | 0.328 | 0.317 | 0.306 | 0.296 | 0.285 | 0.275 | 0.264 | 0.254 | 0.243 | 0.232 | 0.222 | 0.211 | 0.201 | 0.19 | 0.18 | 0.17 | 0.159 | 0.15 | 0.141 | 0.132 | 0.122 | 0.113 | 0.104 | 0.092 | 0.081 | 0.069 | 0.058 | 0.047 | 0.035 | 0.023 | 0.011 |
| 23:15-23:30 | 0.349 | 0.339 | 0.328 | 0.317 | 0.307 | 0.296 | 0.286 | 0.275 | 0.265 | 0.254 | 0.243 | 0.233 | 0.222 | 0.212 | 0.201 | 0.19 | 0.18 | 0.17 | 0.16 | 0.15 | 0.141 | 0.131 | 0.122 | 0.112 | 0.103 | 0.092 | 0.08 | 0.069 | 0.058 | 0.047 | 0.036 | 0.023 | 0.011 |
| 23:30-23:45 | 0.348 | 0.338 | 0.327 | 0.317 | 0.306 | 0.296 | 0.285 | 0.275 | 0.264 | 0.253 | 0.243 | 0.232 | 0.222 | 0.211 | 0.201 | 0.19 | 0.18 | 0.17 | 0.159 | 0.15 | 0.141 | 0.131 | 0.122 | 0.112 | 0.103 | 0.092 | 0.081 | 0.07 | 0.059 | 0.047 | 0.036 | 0.023 | 0.011 |
| 23:45-00:00 | 0.347 | 0.337 | 0.326 | 0.316 | 0.305 | 0.295 | 0.284 | 0.274 | 0.263 | 0.253 | 0.242 | 0.232 | 0.221 | 0.21 | 0.2 | 0.189 | 0.179 | 0.169 | 0.159 | 0.149 | 0.14 | 0.131 | 0.122 | 0.113 | 0.104 | 0.093 | 0.081 | 0.07 | 0.059 | 0.048 | 0.037 | 0.023 | 0.011 |